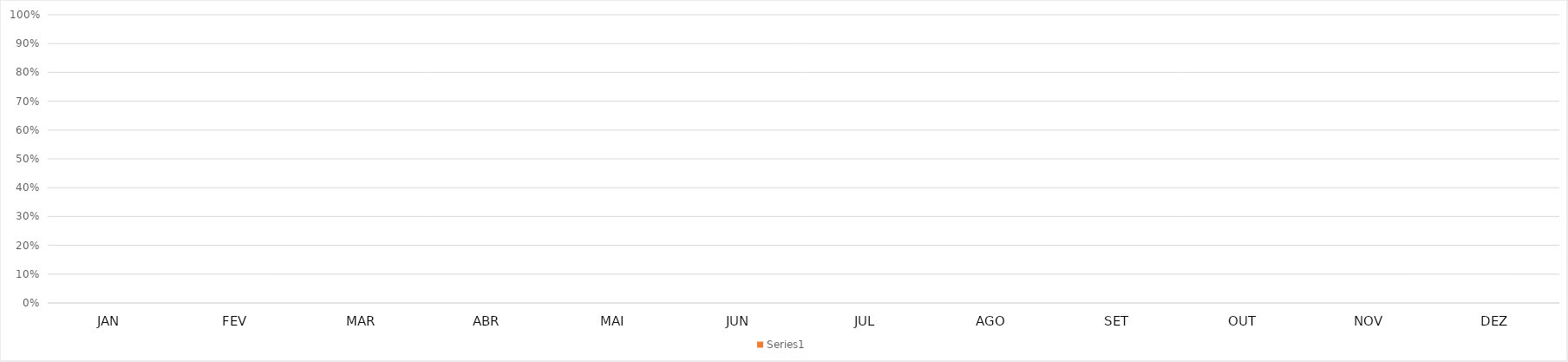
| Category | Series 2 |
|---|---|
| JAN | 0 |
| FEV | 0 |
| MAR | 0 |
| ABR | 0 |
| MAI | 0 |
| JUN | 0 |
| JUL | 0 |
| AGO | 0 |
| SET | 0 |
| OUT | 0 |
| NOV | 0 |
| DEZ | 0 |